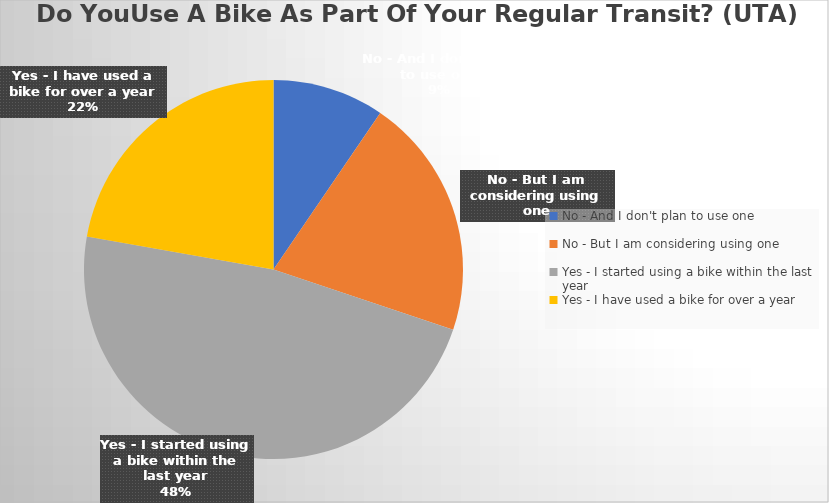
| Category | Series 0 |
|---|---|
| No - And I don't plan to use one | 6 |
| No - But I am considering using one | 13 |
| Yes - I started using a bike within the last year | 30 |
| Yes - I have used a bike for over a year | 14 |